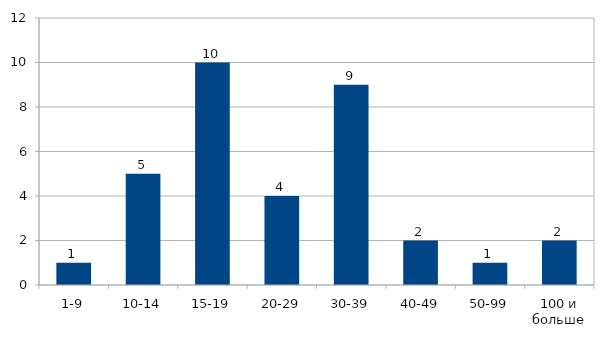
| Category | Series 0 |
|---|---|
| 1-9 | 1 |
| 10-14 | 5 |
| 15-19 | 10 |
| 20-29 | 4 |
| 30-39 | 9 |
| 40-49 | 2 |
| 50-99 | 1 |
| 100 и больше | 2 |